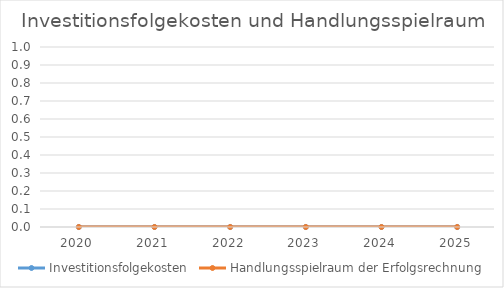
| Category | Investitionsfolgekosten | Handlungsspielraum der Erfolgsrechnung |
|---|---|---|
| 2020.0 | 0 | 0 |
| 2021.0 | 0 | 0 |
| 2022.0 | 0 | 0 |
| 2023.0 | 0 | 0 |
| 2024.0 | 0 | 0 |
| 2025.0 | 0 | 0 |